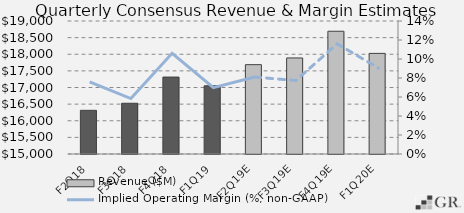
| Category | Revenue ($M) |
|---|---|
|  F2Q18  | 16313 |
|  F3Q18  | 16526 |
|  F4Q18  | 17314 |
|  F1Q19  | 17052 |
|  F2Q19E  | 17686.65 |
|  F3Q19E  | 17889 |
|  F4Q19E  | 18692 |
|  F1Q20E  | 18026 |